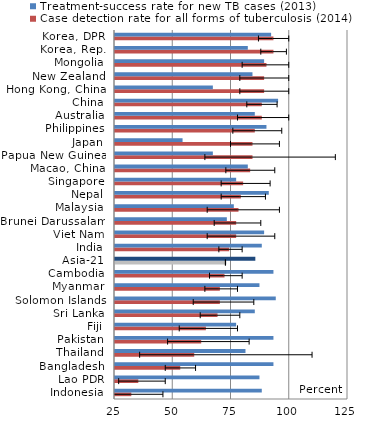
| Category | Case detection rate for all forms of tuberculosis (2014) | Treatment-success rate for new TB cases (2013) |
|---|---|---|
| Indonesia | 32 | 88 |
| Lao PDR | 35 | 87 |
| Bangladesh | 53 | 93 |
| Thailand | 59 | 81 |
| Pakistan | 62 | 93 |
| Fiji | 64 | 77 |
| Sri Lanka | 69 | 85 |
| Solomon Islands | 70 | 94 |
| Myanmar | 70 | 87 |
| Cambodia | 72 | 93 |
| Asia-21 | 72.818 | 85.227 |
| India | 74 | 88 |
| Viet Nam | 77 | 89 |
| Brunei Darussalam | 77 | 73 |
| Malaysia | 78 | 76 |
| Nepal | 79 | 91 |
| Singapore | 80 | 77 |
| Macao, China | 83 | 82 |
| Papua New Guinea | 84 | 67 |
| Japan | 84 | 54 |
| Philippines | 85 | 90 |
| Australia | 88 | 85 |
| China | 88 | 95 |
| Hong Kong, China | 89 | 67 |
| New Zealand | 89 | 84 |
| Mongolia | 90 | 89 |
| Korea, Rep. | 93 | 82 |
| Korea, DPR | 93 | 92 |